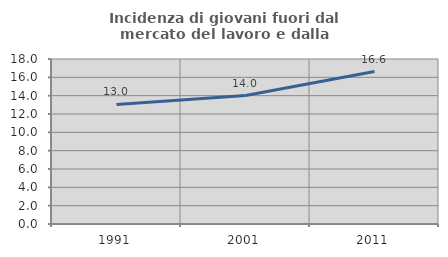
| Category | Incidenza di giovani fuori dal mercato del lavoro e dalla formazione  |
|---|---|
| 1991.0 | 13.039 |
| 2001.0 | 14.016 |
| 2011.0 | 16.632 |